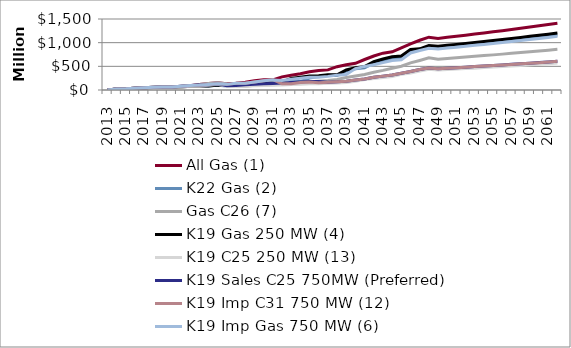
| Category | All Gas (1) | K22 Gas (2) | Gas C26 (7) | K19 Gas 250 MW (4) | K19 C25 250 MW (13) | K19 Sales C25 750MW (Preferred) | K19 Imp C31 750 MW (12) | K19 Imp Gas 750 MW (6) |
|---|---|---|---|---|---|---|---|---|
| 2013.0 | 0 | 0 | 0 | 0 | 0 | 0 | 0 | 0 |
| 2014.0 | 23 | 23 | 23 | 23 | 23 | 23 | 23 | 23 |
| 2015.0 | 24 | 24 | 24 | 24 | 24 | 24 | 24 | 24 |
| 2016.0 | 35 | 35 | 35 | 35 | 35 | 35 | 35 | 35 |
| 2017.0 | 48 | 48 | 48 | 48 | 48 | 48 | 48 | 48 |
| 2018.0 | 54 | 54 | 54 | 56 | 56 | 57 | 56 | 56 |
| 2019.0 | 63 | 63 | 63 | 65 | 65 | 62 | 62 | 62 |
| 2020.0 | 66 | 66 | 66 | 68 | 69 | 64 | 64 | 64 |
| 2021.0 | 75 | 79 | 75 | 66 | 66 | 79 | 79 | 79 |
| 2022.0 | 90 | 94 | 91 | 77 | 77 | 96 | 96 | 96 |
| 2023.0 | 114 | 94 | 115 | 84 | 87 | 104 | 103 | 103 |
| 2024.0 | 135 | 85 | 137 | 87 | 101 | 113 | 115 | 115 |
| 2025.0 | 153 | 99 | 153 | 107 | 120 | 127 | 131 | 130 |
| 2026.0 | 134 | 84 | 127 | 97 | 75 | 90 | 119 | 119 |
| 2027.0 | 143 | 92 | 92 | 110 | 73 | 95 | 141 | 143 |
| 2028.0 | 164 | 94 | 81 | 120 | 80 | 113 | 143 | 144 |
| 2029.0 | 196 | 104 | 98 | 136 | 88 | 123 | 167 | 169 |
| 2030.0 | 219 | 115 | 105 | 162 | 94 | 132 | 195 | 194 |
| 2031.0 | 214 | 132 | 109 | 175 | 99 | 139 | 220 | 211 |
| 2032.0 | 278 | 150 | 122 | 172 | 107 | 149 | 131 | 199 |
| 2033.0 | 311 | 177 | 134 | 246 | 115 | 159 | 130 | 225 |
| 2034.0 | 345 | 177 | 152 | 270 | 122 | 169 | 159 | 247 |
| 2035.0 | 384 | 251 | 172 | 296 | 131 | 181 | 170 | 270 |
| 2036.0 | 411 | 283 | 187 | 302 | 133 | 182 | 153 | 268 |
| 2037.0 | 425 | 311 | 201 | 323 | 141 | 166 | 162 | 288 |
| 2038.0 | 493 | 309 | 224 | 321 | 150 | 174 | 173 | 314 |
| 2039.0 | 535 | 402 | 263 | 423 | 160 | 187 | 186 | 328 |
| 2040.0 | 563 | 448 | 297 | 469 | 183 | 212 | 210 | 452 |
| 2041.0 | 644 | 470 | 326 | 493 | 220 | 233 | 232 | 495 |
| 2042.0 | 718 | 570 | 376 | 597 | 242 | 269 | 268 | 535 |
| 2043.0 | 778 | 628 | 414 | 654 | 263 | 293 | 293 | 579 |
| 2044.0 | 806 | 677 | 460 | 702 | 286 | 319 | 317 | 622 |
| 2045.0 | 890 | 689 | 502 | 717 | 331 | 353 | 352 | 640 |
| 2046.0 | 976 | 801 | 572 | 856 | 361 | 390 | 389 | 783 |
| 2047.0 | 1051 | 860 | 624 | 869 | 403 | 434 | 433 | 833 |
| 2048.0 | 1116 | 910 | 679 | 939 | 439 | 466 | 465 | 883 |
| 2049.0 | 1090 | 893 | 652 | 925 | 421 | 450 | 450 | 868 |
| 2050.0 | 1113 | 912 | 667 | 944 | 431 | 461 | 460 | 887 |
| 2051.0 | 1135 | 931 | 681 | 964 | 441 | 472 | 471 | 905 |
| 2052.0 | 1158 | 950 | 696 | 984 | 452 | 483 | 482 | 924 |
| 2053.0 | 1182 | 970 | 711 | 1004 | 462 | 494 | 494 | 943 |
| 2054.0 | 1205 | 990 | 727 | 1025 | 473 | 506 | 505 | 963 |
| 2055.0 | 1230 | 1010 | 742 | 1046 | 484 | 518 | 517 | 983 |
| 2056.0 | 1254 | 1031 | 758 | 1067 | 496 | 530 | 529 | 1003 |
| 2057.0 | 1280 | 1052 | 774 | 1089 | 507 | 542 | 541 | 1024 |
| 2058.0 | 1305 | 1074 | 791 | 1111 | 519 | 554 | 553 | 1045 |
| 2059.0 | 1331 | 1096 | 808 | 1134 | 531 | 567 | 566 | 1066 |
| 2060.0 | 1358 | 1118 | 825 | 1157 | 543 | 579 | 578 | 1088 |
| 2061.0 | 1385 | 1141 | 842 | 1180 | 555 | 592 | 591 | 1110 |
| 2062.0 | 1412 | 1164 | 860 | 1204 | 568 | 606 | 605 | 1133 |